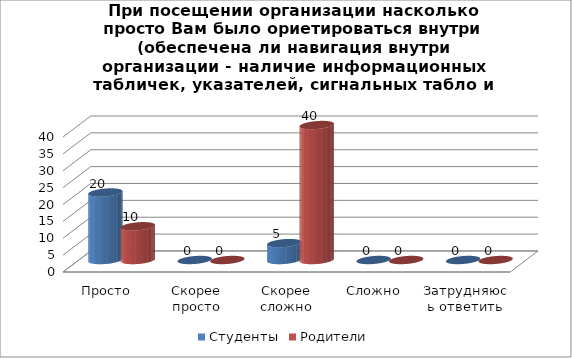
| Category | Студенты | Родители |
|---|---|---|
| Просто | 20 | 10 |
| Скорее просто | 0 | 0 |
| Скорее сложно | 5 | 40 |
| Сложно | 0 | 0 |
| Затрудняюсь ответить | 0 | 0 |